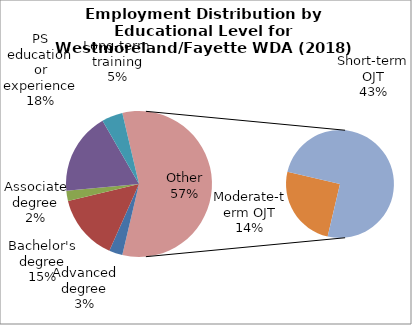
| Category | Series 0 |
|---|---|
| Advanced degree | 5650 |
| Bachelor's degree | 27680 |
| Associate degree | 4300 |
| PS education or experience | 34310 |
| Long-term training | 8800 |
| Moderate-term OJT | 27120 |
| Short-term OJT | 81460 |